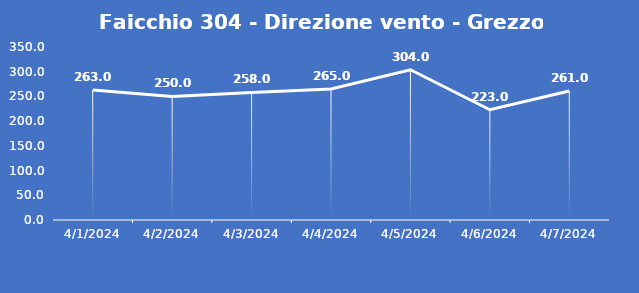
| Category | Faicchio 304 - Direzione vento - Grezzo (°N) |
|---|---|
| 4/1/24 | 263 |
| 4/2/24 | 250 |
| 4/3/24 | 258 |
| 4/4/24 | 265 |
| 4/5/24 | 304 |
| 4/6/24 | 223 |
| 4/7/24 | 261 |